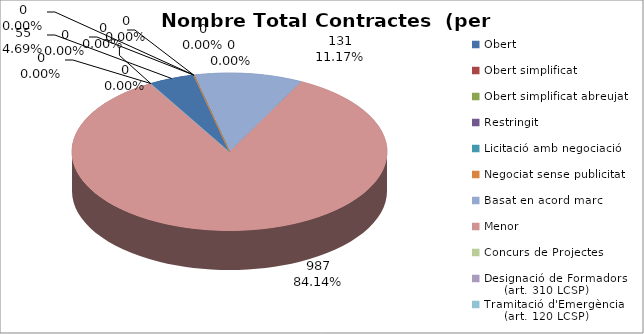
| Category | Nombre Total Contractes |
|---|---|
| Obert | 55 |
| Obert simplificat | 0 |
| Obert simplificat abreujat | 0 |
| Restringit | 0 |
| Licitació amb negociació | 0 |
| Negociat sense publicitat | 0 |
| Basat en acord marc | 131 |
| Menor | 987 |
| Concurs de Projectes | 0 |
| Designació de Formadors
     (art. 310 LCSP) | 0 |
| Tramitació d'Emergència
     (art. 120 LCSP) | 0 |